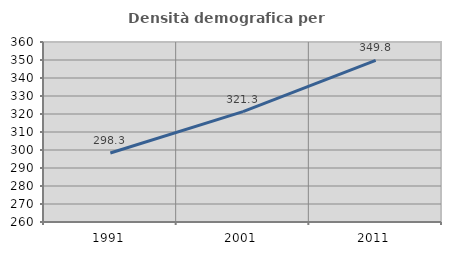
| Category | Densità demografica |
|---|---|
| 1991.0 | 298.348 |
| 2001.0 | 321.3 |
| 2011.0 | 349.831 |